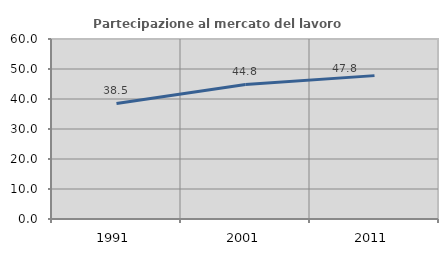
| Category | Partecipazione al mercato del lavoro  femminile |
|---|---|
| 1991.0 | 38.503 |
| 2001.0 | 44.849 |
| 2011.0 | 47.792 |